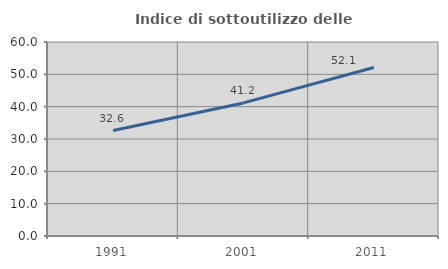
| Category | Indice di sottoutilizzo delle abitazioni  |
|---|---|
| 1991.0 | 32.621 |
| 2001.0 | 41.161 |
| 2011.0 | 52.103 |